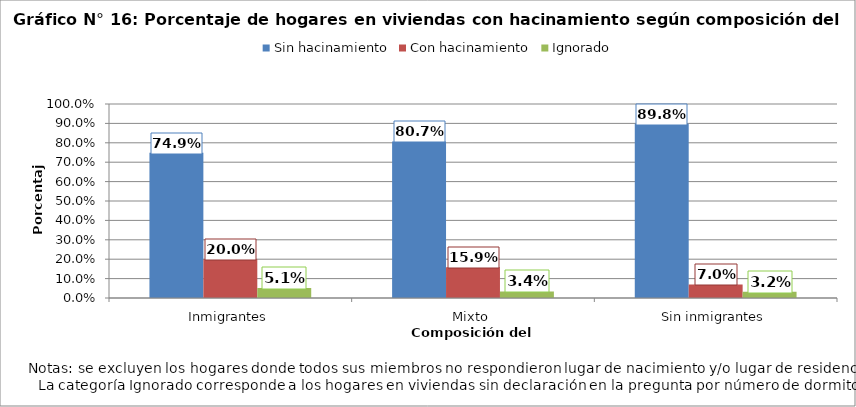
| Category | Sin hacinamiento | Con hacinamiento | Ignorado |
|---|---|---|---|
| Inmigrantes | 0.749 | 0.2 | 0.051 |
| Mixto | 0.807 | 0.159 | 0.034 |
| Sin inmigrantes | 0.898 | 0.07 | 0.032 |